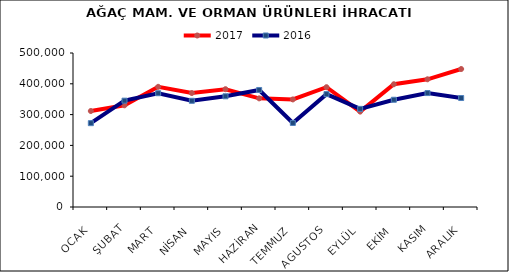
| Category | 2017 | 2016 |
|---|---|---|
| OCAK | 311625.534 | 272169.444 |
| ŞUBAT | 330155.359 | 345267.605 |
| MART | 390185.197 | 369383.518 |
| NİSAN | 369981.438 | 344801.37 |
| MAYIS | 382477.285 | 359455.336 |
| HAZİRAN | 352725.149 | 379940.831 |
| TEMMUZ | 349274.297 | 272883.784 |
| AGUSTOS | 389030.643 | 366526.902 |
| EYLÜL | 309714.986 | 318536.955 |
| EKİM | 398569.342 | 348173.177 |
| KASIM | 414634.759 | 369971.684 |
| ARALIK | 448021.631 | 353834.065 |